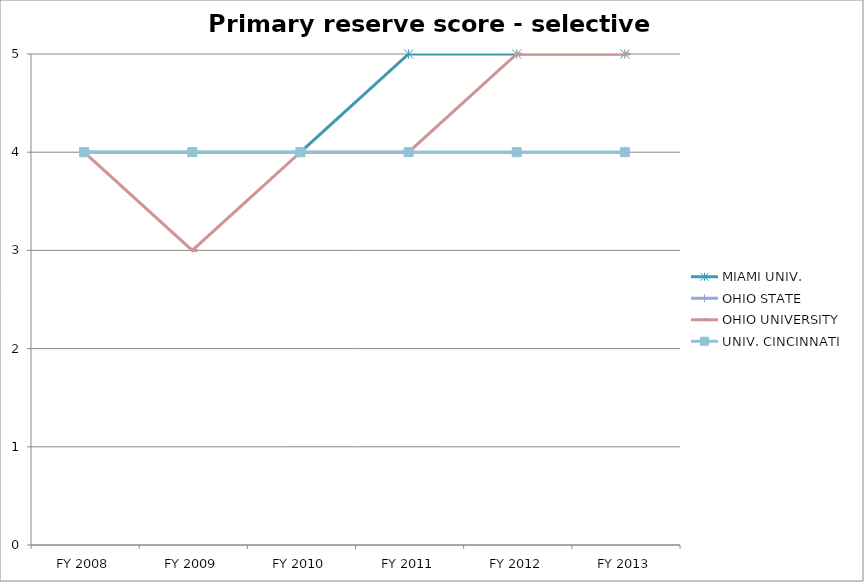
| Category | MIAMI UNIV.  | OHIO STATE  | OHIO UNIVERSITY  | UNIV. CINCINNATI  |
|---|---|---|---|---|
| FY 2013 | 5 | 4 | 5 | 4 |
| FY 2012 | 5 | 4 | 5 | 4 |
| FY 2011 | 5 | 4 | 4 | 4 |
| FY 2010 | 4 | 4 | 4 | 4 |
| FY 2009 | 4 | 4 | 3 | 4 |
| FY 2008 | 4 | 4 | 4 | 4 |